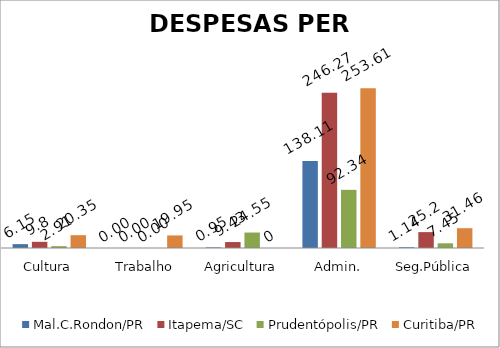
| Category | Mal.C.Rondon/PR | Itapema/SC | Prudentópolis/PR | Toledo/PR | Cascavel/PR | Curitiba/PR |
|---|---|---|---|---|---|---|
| Cultura | 6.15 | 9.8 | 2.91 |  |  | 20.35 |
| Trabalho | 0 | 0 | 0 |  |  | 19.95 |
| Agricultura | 0.95 | 9.43 | 24.55 |  |  | 0 |
| Admin. | 138.11 | 246.27 | 92.34 |  |  | 253.61 |
| Seg.Pública | 1.14 | 25.2 | 7.45 |  |  | 31.46 |